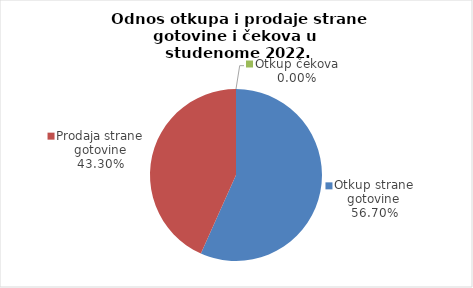
| Category | Series 0 |
|---|---|
| Otkup strane gotovine | 56.699 |
| Prodaja strane gotovine | 43.301 |
| Otkup čekova | 0 |